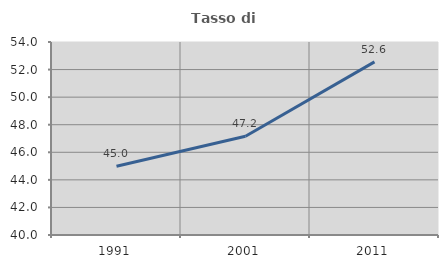
| Category | Tasso di occupazione   |
|---|---|
| 1991.0 | 44.99 |
| 2001.0 | 47.162 |
| 2011.0 | 52.559 |